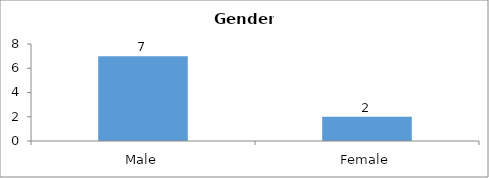
| Category | Gender |
|---|---|
| Male | 7 |
| Female | 2 |